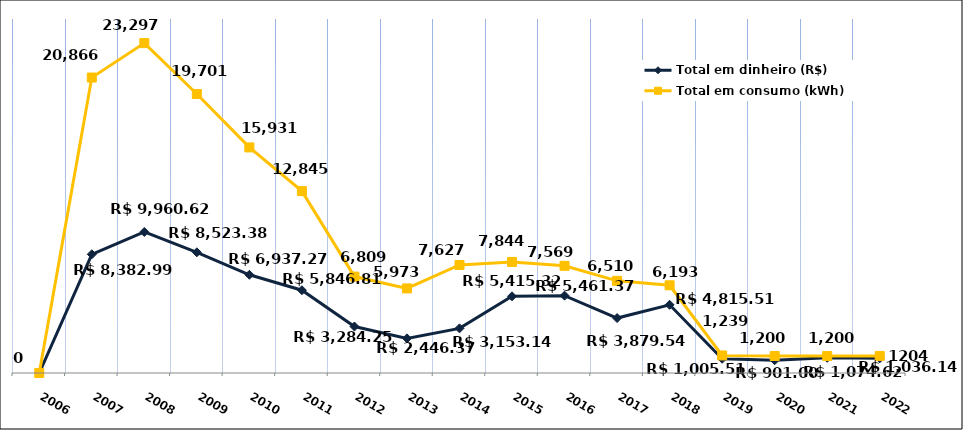
| Category | Total em dinheiro (R$) |
|---|---|
| 2006.0 | 0 |
| 2007.0 | 8382.99 |
| 2008.0 | 9960.62 |
| 2009.0 | 8523.38 |
| 2010.0 | 6937.27 |
| 2011.0 | 5846.81 |
| 2012.0 | 3284.25 |
| 2013.0 | 2446.37 |
| 2014.0 | 3153.14 |
| 2015.0 | 5415.32 |
| 2016.0 | 5461.37 |
| 2017.0 | 3879.54 |
| 2018.0 | 4815.51 |
| 2019.0 | 1005.51 |
| 2020.0 | 901 |
| 2021.0 | 1074.62 |
| 2022.0 | 1036.14 |